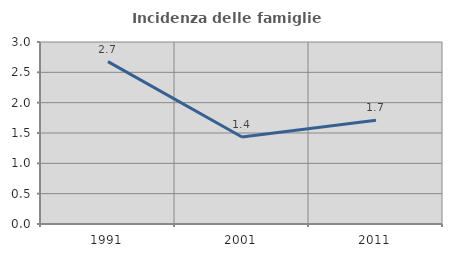
| Category | Incidenza delle famiglie numerose |
|---|---|
| 1991.0 | 2.677 |
| 2001.0 | 1.435 |
| 2011.0 | 1.712 |